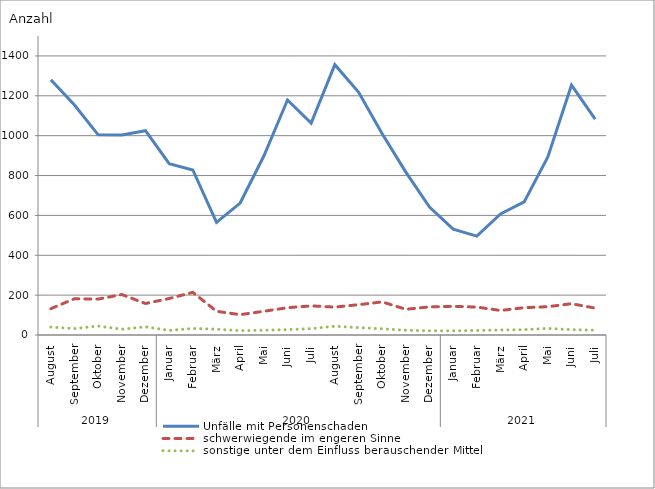
| Category | Unfälle mit Personenschaden | schwerwiegende im engeren Sinne | sonstige unter dem Einfluss berauschender Mittel |
|---|---|---|---|
| 0 | 1281 | 132 | 40 |
| 1 | 1154 | 182 | 32 |
| 2 | 1004 | 180 | 45 |
| 3 | 1003 | 203 | 29 |
| 4 | 1025 | 158 | 41 |
| 5 | 860 | 183 | 23 |
| 6 | 828 | 214 | 33 |
| 7 | 565 | 119 | 29 |
| 8 | 662 | 102 | 22 |
| 9 | 898 | 119 | 24 |
| 10 | 1179 | 137 | 27 |
| 11 | 1063 | 146 | 32 |
| 12 | 1356 | 140 | 44 |
| 13 | 1219 | 152 | 37 |
| 14 | 1010 | 166 | 31 |
| 15 | 817 | 129 | 24 |
| 16 | 642 | 141 | 21 |
| 17 | 531 | 144 | 21 |
| 18 | 496 | 140 | 23 |
| 19 | 607 | 123 | 25 |
| 20 | 668 | 137 | 27 |
| 21 | 893 | 142 | 33 |
| 22 | 1254 | 157 | 27 |
| 23 | 1083 | 135 | 24 |